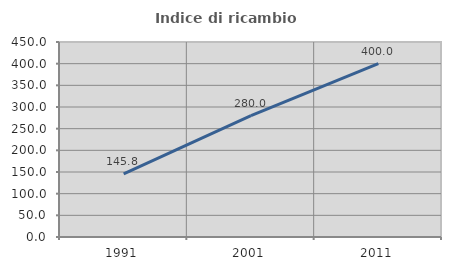
| Category | Indice di ricambio occupazionale  |
|---|---|
| 1991.0 | 145.763 |
| 2001.0 | 280 |
| 2011.0 | 400 |